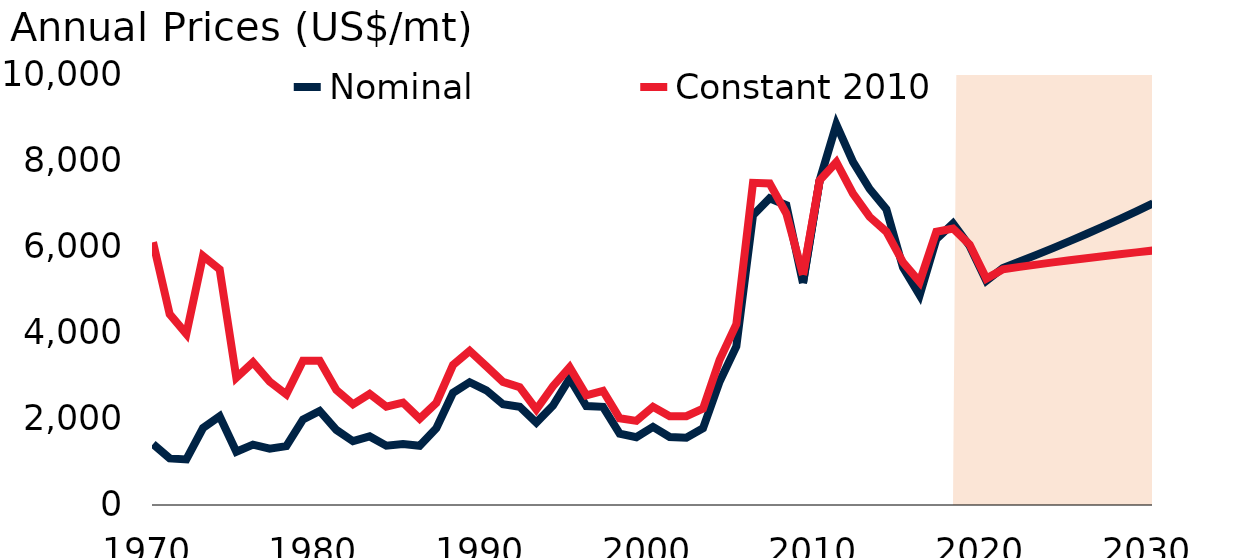
| Category | Nominal | Constant 2010 |
|---|---|---|
| 1970.0 | 1415.7 | 6098.316 |
| 1971.0 | 1081.417 | 4429.376 |
| 1972.0 | 1057.675 | 3971.346 |
| 1973.0 | 1785.358 | 5780.365 |
| 1974.0 | 2058.5 | 5468.925 |
| 1975.0 | 1234.75 | 2953.746 |
| 1976.0 | 1400.75 | 3310.216 |
| 1977.0 | 1308.75 | 2861.138 |
| 1978.0 | 1364.833 | 2567.516 |
| 1979.0 | 1985.258 | 3347.899 |
| 1980.0 | 2182.092 | 3345.517 |
| 1981.0 | 1741.95 | 2667.658 |
| 1982.0 | 1480.442 | 2336.779 |
| 1983.0 | 1591.925 | 2581.198 |
| 1984.0 | 1377.317 | 2283.479 |
| 1985.0 | 1417.383 | 2374.669 |
| 1986.0 | 1373.782 | 2001.119 |
| 1987.0 | 1782.503 | 2369.398 |
| 1988.0 | 2601.672 | 3247.496 |
| 1989.0 | 2848.41 | 3576.916 |
| 1990.0 | 2661.482 | 3219.314 |
| 1991.0 | 2338.782 | 2855.233 |
| 1992.0 | 2281.158 | 2733.787 |
| 1993.0 | 1913.077 | 2216.194 |
| 1994.0 | 2307.418 | 2755.786 |
| 1995.0 | 2935.606 | 3193.652 |
| 1996.0 | 2294.857 | 2545.072 |
| 1997.0 | 2276.767 | 2649.802 |
| 1998.0 | 1654.058 | 2012.948 |
| 1999.0 | 1572.861 | 1951.649 |
| 2000.0 | 1813.469 | 2279.384 |
| 2001.0 | 1578.288 | 2061.051 |
| 2002.0 | 1559.478 | 2060.544 |
| 2003.0 | 1779.145 | 2234.602 |
| 2004.0 | 2865.885 | 3370.595 |
| 2005.0 | 3678.876 | 4194.635 |
| 2006.0 | 6722.134 | 7475.172 |
| 2007.0 | 7118.226 | 7459.13 |
| 2008.0 | 6955.88 | 6764.189 |
| 2009.0 | 5149.739 | 5338.613 |
| 2010.0 | 7534.78 | 7534.78 |
| 2011.0 | 8828.188 | 7953.627 |
| 2012.0 | 7962.347 | 7226.989 |
| 2013.0 | 7332.1 | 6684.109 |
| 2014.0 | 6863.398 | 6342.228 |
| 2015.0 | 5510.457 | 5631.076 |
| 2016.0 | 4867.898 | 5176.761 |
| 2017.0 | 6169.94 | 6339.762 |
| 2018.0 | 6529.798 | 6415.62 |
| 2019.0 | 6010.145 | 6041.681 |
| 2020.0 | 5200 | 5253.081 |
| 2021.0 | 5500 | 5468.784 |
| 2022.0 | 5649.369 | 5524.726 |
| 2023.0 | 5802.795 | 5577.991 |
| 2024.0 | 5960.387 | 5629.109 |
| 2025.0 | 6122.26 | 5678.429 |
| 2026.0 | 6288.528 | 5726.189 |
| 2027.0 | 6459.312 | 5772.551 |
| 2028.0 | 6634.734 | 5817.628 |
| 2029.0 | 6814.92 | 5861.494 |
| 2030.0 | 7000 | 5904.198 |